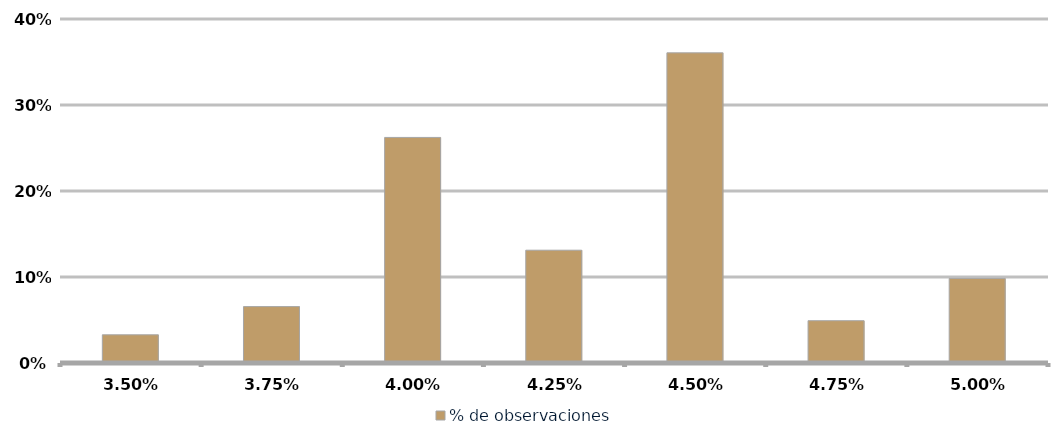
| Category | % de observaciones  |
|---|---|
| 0.03499999999999999 | 0.033 |
| 0.03749999999999999 | 0.066 |
| 0.039999999999999994 | 0.262 |
| 0.042499999999999996 | 0.131 |
| 0.045 | 0.361 |
| 0.0475 | 0.049 |
| 0.05 | 0.098 |